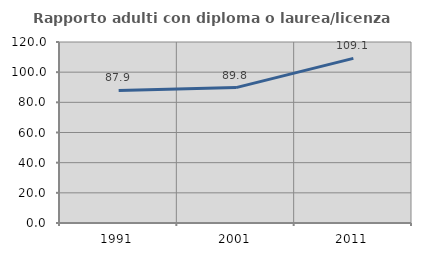
| Category | Rapporto adulti con diploma o laurea/licenza media  |
|---|---|
| 1991.0 | 87.919 |
| 2001.0 | 89.756 |
| 2011.0 | 109.135 |